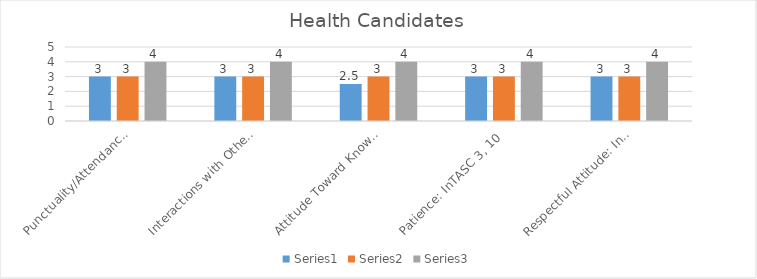
| Category | Series 0 | Series 1 | Series 2 |
|---|---|---|---|
| Punctuality/Attendance: InTASC 1, 9 | 3 | 3 | 4 |
| Interactions with Others: InTASC 3, 7, 10 | 3 | 3 | 4 |
| Attitude Toward Knowledge and Learning: InTASC 1, 4, 5, 9, 10 | 2.5 | 3 | 4 |
| Patience: InTASC 3, 10 | 3 | 3 | 4 |
| Respectful Attitude: InTASC 3, 7, 10 | 3 | 3 | 4 |